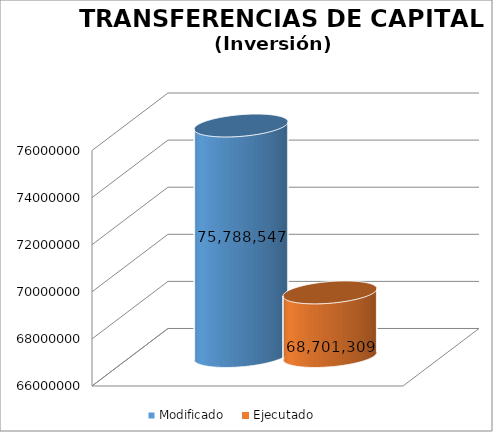
| Category | Modificado | Ejecutado |
|---|---|---|
| 0 | 75788547 | 68701308.57 |